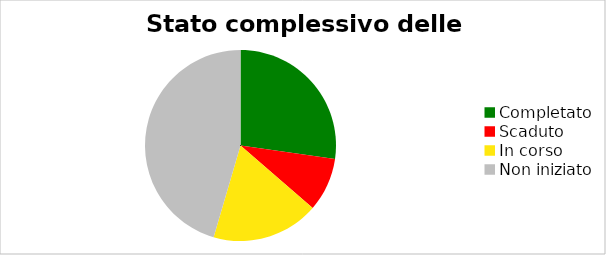
| Category | Series 0 |
|---|---|
| Completato | 0.273 |
| Scaduto | 0.091 |
| In corso | 0.182 |
| Non iniziato | 0.455 |